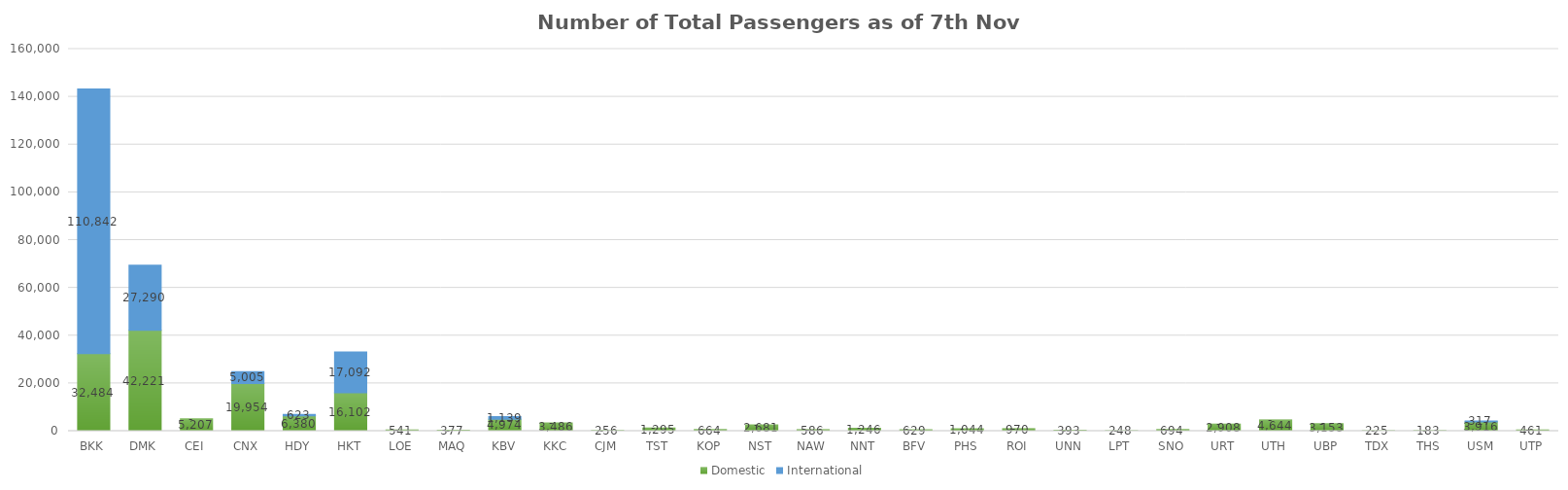
| Category | Domestic | International |
|---|---|---|
| BKK | 32484 | 110842 |
| DMK | 42221 | 27290 |
| CEI | 5207 | 0 |
| CNX | 19954 | 5005 |
| HDY | 6380 | 623 |
| HKT | 16102 | 17092 |
| LOE | 541 | 0 |
| MAQ | 377 | 0 |
| KBV | 4974 | 1139 |
| KKC | 3486 | 0 |
| CJM | 256 | 0 |
| TST | 1295 | 0 |
| KOP | 664 | 0 |
| NST | 2681 | 0 |
| NAW | 586 | 0 |
| NNT | 1246 | 0 |
| BFV | 629 | 0 |
| PHS | 1044 | 0 |
| ROI | 970 | 0 |
| UNN | 393 | 0 |
| LPT | 248 | 0 |
| SNO | 694 | 0 |
| URT | 2908 | 0 |
| UTH | 4644 | 0 |
| UBP | 3153 | 0 |
| TDX | 225 | 0 |
| THS | 183 | 0 |
| USM | 3916 | 317 |
| UTP | 461 | 0 |